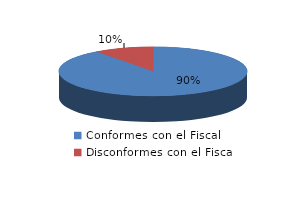
| Category | Series 0 |
|---|---|
| 0 | 53 |
| 1 | 6 |